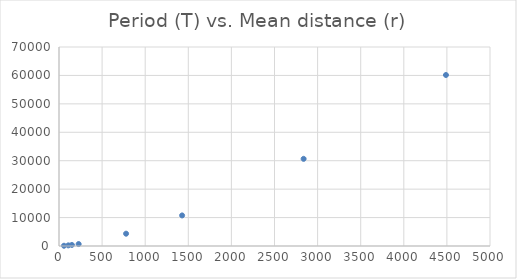
| Category | Series 0 |
|---|---|
| 57.9 | 88 |
| 108.2 | 225 |
| 149.6 | 365 |
| 227.9 | 687 |
| 778.1 | 4329 |
| 1428.2 | 10753 |
| 2837.9 | 30660 |
| 4488.9 | 60150 |